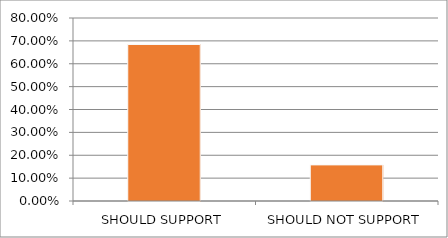
| Category | Series 0 |
|---|---|
| SHOULD SUPPORT | 0.684 |
| SHOULD NOT SUPPORT | 0.158 |